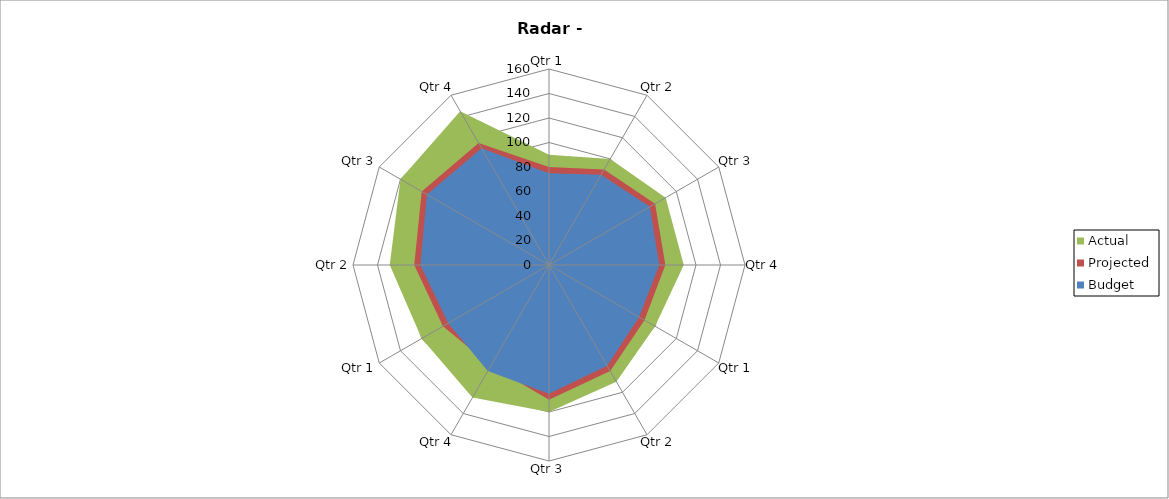
| Category | Actual | Projected | Budget |
|---|---|---|---|
| 0 | 90 | 80 | 75 |
| 1 | 100 | 90 | 85 |
| 2 | 110 | 100 | 95 |
| 3 | 110 | 95 | 90 |
| 4 | 100 | 90 | 85 |
| 5 | 110 | 100 | 95 |
| 6 | 120 | 110 | 105 |
| 7 | 125 | 95 | 100 |
| 8 | 120 | 100 | 95 |
| 9 | 130 | 110 | 105 |
| 10 | 140 | 120 | 115 |
| 11 | 145 | 115 | 110 |